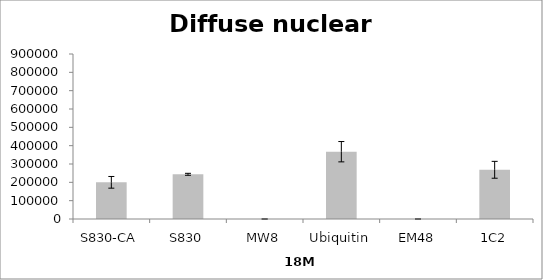
| Category | Ave |
|---|---|
| S830-CA | 200081.424 |
| S830 | 243819.06 |
| MW8 | 0 |
| Ubiquitin | 367050.267 |
| EM48 | 0 |
| 1C2 | 268450.541 |